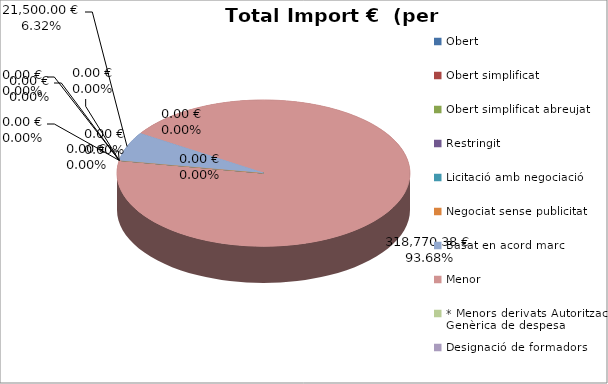
| Category | Total preu              (amb iva) |
|---|---|
| Obert | 0 |
| Obert simplificat | 0 |
| Obert simplificat abreujat | 0 |
| Restringit | 0 |
| Licitació amb negociació | 0 |
| Negociat sense publicitat | 0 |
| Basat en acord marc | 21500 |
| Menor | 318770.38 |
| * Menors derivats Autorització Genèrica de despesa | 0 |
| Designació de formadors | 0 |